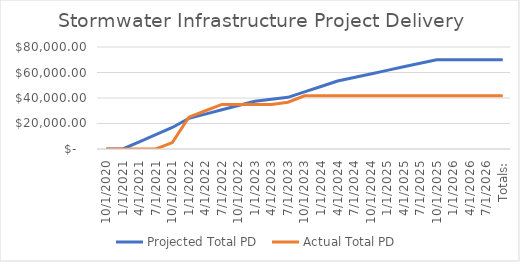
| Category | Projected Total PD  | Actual Total PD  |
|---|---|---|
| 10/1/2020 | 0 | 0 |
| 1/1/2021 | 0 | 0 |
| 4/1/2021 | 5625 | 0 |
| 7/1/2021 | 11250 | 0 |
| 10/1/2021 | 16875 | 5000 |
| 1/1/2022 | 24000 | 25000 |
| 4/1/2022 | 27375 | 30000 |
| 7/1/2022 | 30750 | 35000 |
| 10/1/2022 | 34125 | 35000 |
| 1/1/2023 | 37500 | 35000 |
| 4/1/2023 | 39000 | 35000 |
| 7/1/2023 | 40500 | 36711.5 |
| 10/1/2023 | 44777.778 | 41735.81 |
| 1/1/2024 | 49055.556 | 41759.62 |
| 4/1/2024 | 53333.333 | 41759.62 |
| 7/1/2024 | 56111.111 | 41759.62 |
| 10/1/2024 | 58888.889 | 41759.62 |
| 1/1/2025 | 61666.667 | 41759.62 |
| 4/1/2025 | 64444.444 | 41759.62 |
| 7/1/2025 | 67222.222 | 41759.62 |
| 10/1/2025 | 70000 | 41759.62 |
| 1/1/2026 | 70000 | 41759.62 |
| 4/1/2026 | 70000 | 41759.62 |
| 7/1/2026 | 70000 | 41759.62 |
| Totals: | 70000 | 41759.62 |